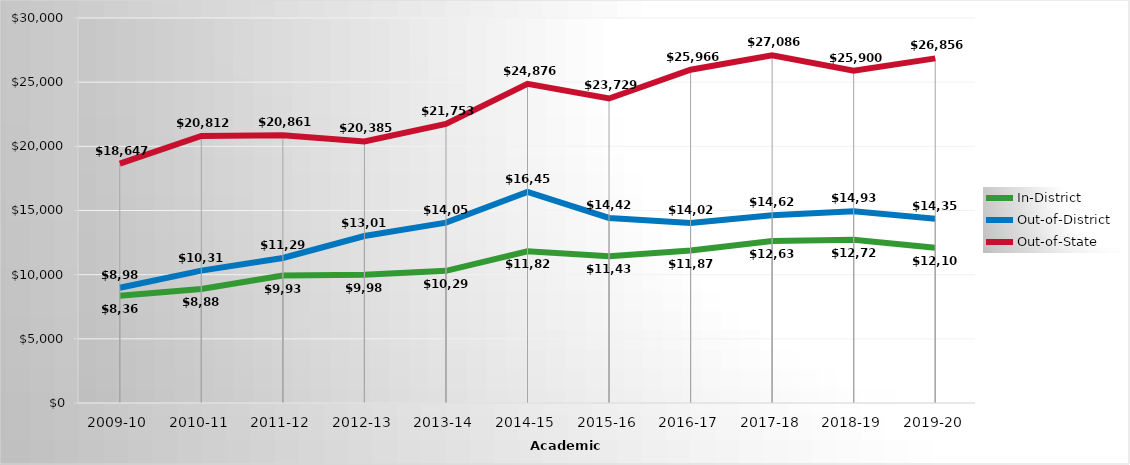
| Category | In-District | Out-of-District | Out-of-State |
|---|---|---|---|
| 2009-10 | 8363 | 8984 | 18647 |
| 2010-11 | 8889 | 10313 | 20812 |
| 2011-12 | 9933.23 | 11297.18 | 20861.23 |
| 2012-13 | 9988.67 | 13011.78 | 20384.67 |
| 2013-14 | 10297.84 | 14057.56 | 21753.28 |
| 2014-15 | 11827.062 | 16453.562 | 24875.688 |
| 2015-16 | 11438 | 14422 | 23729 |
| 2016-17 | 11878 | 14022 | 25966 |
| 2017-18 | 12630 | 14628 | 27086 |
| 2018-19 | 12724 | 14934 | 25900 |
| 2019-20 | 12106 | 14351 | 26856 |